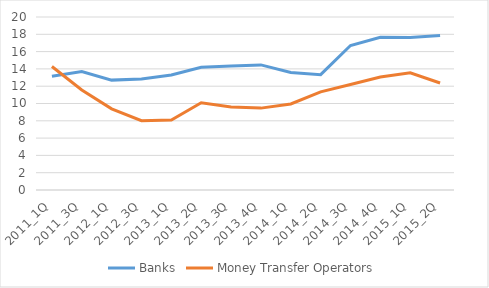
| Category | Banks | Money Transfer Operators |
|---|---|---|
| 2011_1Q | 13.15 | 14.271 |
| 2011_3Q | 13.69 | 11.572 |
| 2012_1Q | 12.703 | 9.383 |
| 2012_3Q | 12.835 | 8.018 |
| 2013_1Q | 13.3 | 8.097 |
| 2013_2Q | 14.177 | 10.09 |
| 2013_3Q | 14.321 | 9.607 |
| 2013_4Q | 14.463 | 9.466 |
| 2014_1Q | 13.585 | 9.948 |
| 2014_2Q | 13.331 | 11.34 |
| 2014_3Q | 16.703 | 12.196 |
| 2014_4Q | 17.665 | 13.071 |
| 2015_1Q | 17.636 | 13.552 |
| 2015_2Q | 17.87 | 12.366 |